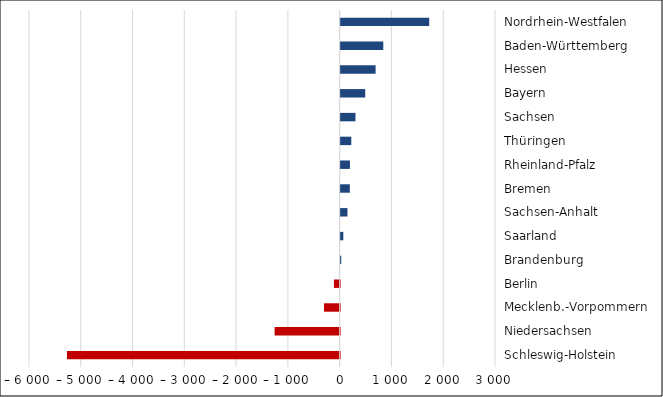
| Category | Series 0 |
|---|---|
| Schleswig-Holstein | -5267 |
| Niedersachsen | -1257 |
| Mecklenb.-Vorpommern | -303 |
| Berlin | -111 |
| Brandenburg | 11 |
| Saarland | 51 |
| Sachsen-Anhalt | 131 |
| Bremen | 177 |
| Rheinland-Pfalz | 179 |
| Thüringen | 205 |
| Sachsen | 286 |
| Bayern | 474 |
| Hessen | 675 |
| Baden-Württemberg | 823 |
| Nordrhein-Westfalen | 1710 |